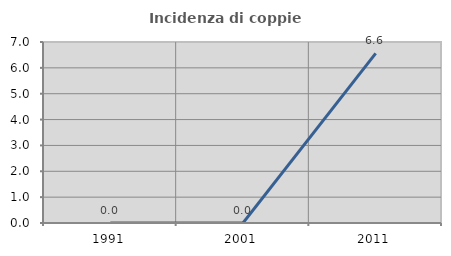
| Category | Incidenza di coppie miste |
|---|---|
| 1991.0 | 0 |
| 2001.0 | 0 |
| 2011.0 | 6.557 |